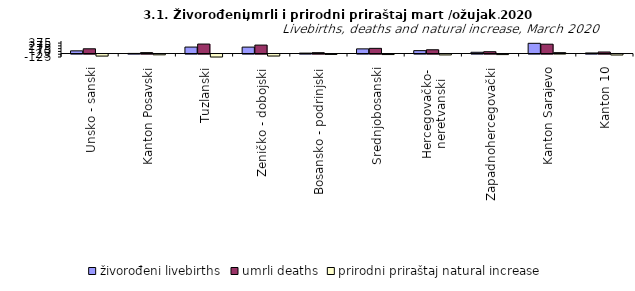
| Category | živorođeni livebirths | umrli deaths | prirodni priraštaj natural increase |
|---|---|---|---|
| Unsko - sanski | 96 | 170 | -74 |
| Kanton Posavski | 4 | 32 | -28 |
| Tuzlanski | 232 | 340 | -108 |
| Zeničko - dobojski | 231 | 303 | -72 |
| Bosansko - podrinjski | 15 | 30 | -15 |
| Srednjobosanski | 167 | 186 | -19 |
| Hercegovačko-
neretvanski | 103 | 135 | -32 |
| Zapadnohercegovački | 45 | 65 | -20 |
| Kanton Sarajevo | 367 | 335 | 32 |
| Kanton 10 | 20 | 55 | -35 |